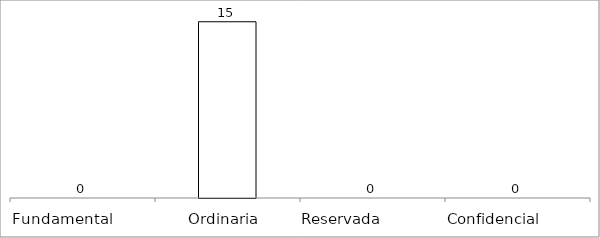
| Category | Series 0 |
|---|---|
| Fundamental         | 0 |
| Ordinaria  | 15 |
| Reservada               | 0 |
| Confidencial             | 0 |